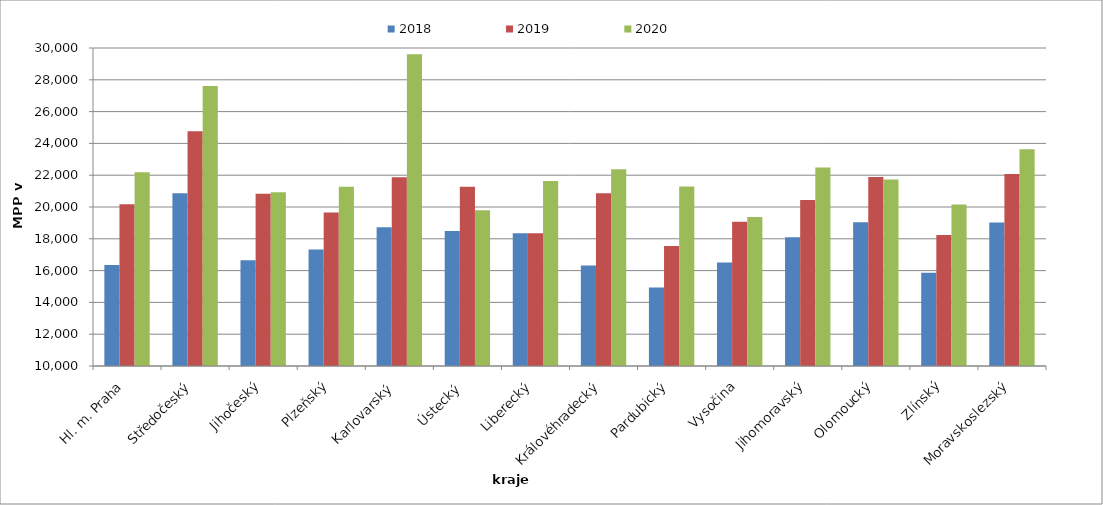
| Category | 2018 | 2019 | 2020 |
|---|---|---|---|
| Hl. m. Praha | 16345.866 | 20168.824 | 22183.455 |
| Středočeský | 20869.622 | 24762.069 | 27608.276 |
| Jihočeský | 16653.427 | 20838.484 | 20935.362 |
| Plzeňský | 17322.259 | 19648.79 | 21270.812 |
| Karlovarský  | 18733.333 | 21866.667 | 29600 |
| Ústecký   | 18493.497 | 21267.487 | 19799.392 |
| Liberecký | 18349.962 | 18349.962 | 21639.233 |
| Královéhradecký | 16325.462 | 20861.538 | 22367.023 |
| Pardubický | 14938.885 | 17554.541 | 21283.708 |
| Vysočina | 16513.573 | 19073.13 | 19373.961 |
| Jihomoravský | 18094.99 | 20433.667 | 22481.964 |
| Olomoucký | 19033.896 | 21889.046 | 21731.499 |
| Zlínský | 15863.664 | 18236.08 | 20152.306 |
| Moravskoslezský | 19032.92 | 22076.632 | 23636.364 |